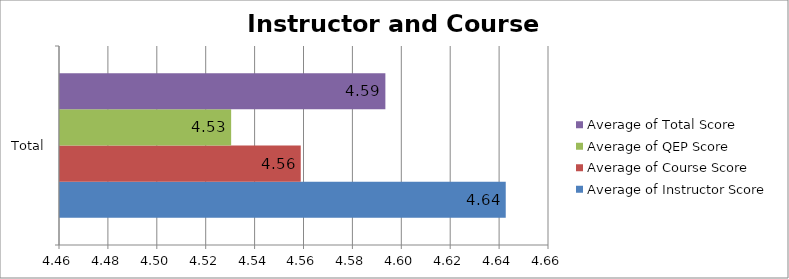
| Category | Average of Instructor Score | Average of Course Score | Average of QEP Score | Average of Total Score |
|---|---|---|---|---|
| Total | 4.642 | 4.558 | 4.53 | 4.593 |